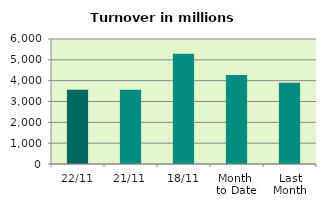
| Category | Series 0 |
|---|---|
| 22/11 | 3564.654 |
| 21/11 | 3560.809 |
| 18/11 | 5297.787 |
| Month 
to Date | 4269.04 |
| Last
Month | 3895.685 |